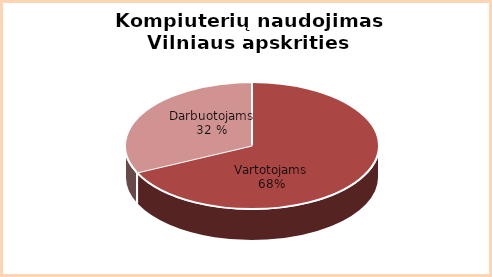
| Category | Series 0 |
|---|---|
| Vartotojams | 0.68 |
| Darbuotojams | 0.32 |